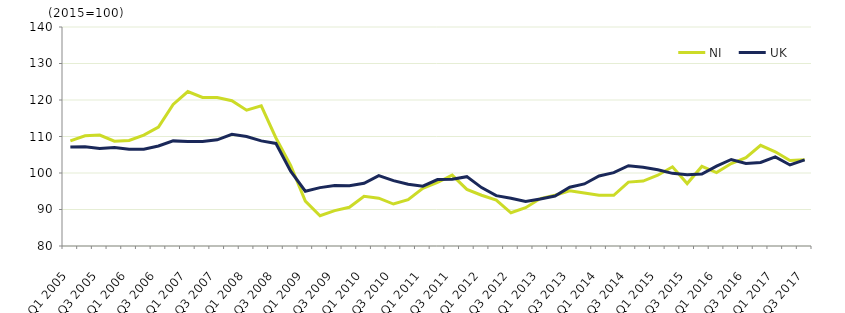
| Category | NI  | UK  |
|---|---|---|
| Q1 2005 | 108.8 | 107.1 |
|  | 110.2 | 107.2 |
| Q3 2005 | 110.4 | 106.7 |
|  | 108.7 | 107 |
| Q1 2006 | 108.9 | 106.5 |
|  | 110.4 | 106.5 |
| Q3 2006 | 112.6 | 107.4 |
|  | 118.8 | 108.8 |
| Q1 2007 | 122.3 | 108.6 |
|  | 120.7 | 108.6 |
| Q3 2007 | 120.7 | 109.1 |
|  | 119.8 | 110.6 |
| Q1 2008 | 117.2 | 110 |
|  | 118.4 | 108.8 |
| Q3 2008 | 109.6 | 108.1 |
|  | 102.1 | 100.5 |
| Q1 2009 | 92.3 | 95 |
|  | 88.3 | 96 |
| Q3 2009 | 89.7 | 96.6 |
|  | 90.6 | 96.5 |
| Q1 2010 | 93.6 | 97.2 |
|  | 93.1 | 99.3 |
| Q3 2010 | 91.5 | 97.9 |
|  | 92.7 | 96.9 |
| Q1 2011 | 95.8 | 96.4 |
|  | 97.4 | 98.2 |
| Q3 2011 | 99.4 | 98.3 |
|  | 95.5 | 99 |
| Q1 2012 | 93.9 | 96 |
|  | 92.6 | 93.8 |
| Q3 2012 | 89.1 | 93.1 |
|  | 90.5 | 92.2 |
| Q1 2013 | 93 | 92.9 |
|  | 93.9 | 93.7 |
| Q3 2013 | 95.1 | 96.1 |
|  | 94.5 | 97 |
| Q1 2014 | 93.9 | 99.2 |
|  | 93.9 | 100.1 |
| Q3 2014 | 97.5 | 102 |
|  | 97.8 | 101.6 |
| Q1 2015 | 99.4 | 100.9 |
|  | 101.7 | 99.9 |
| Q3 2015 | 97.1 | 99.5 |
|  | 101.8 | 99.7 |
| Q1 2016 | 100.1 | 101.9 |
|  | 102.6 | 103.7 |
| Q3 2016 | 104.2 | 102.6 |
|  | 107.6 | 102.9 |
| Q1 2017 | 105.8 | 104.4 |
|  | 103.4 | 102.2 |
| Q3 2017 | 103.6 | 103.6 |